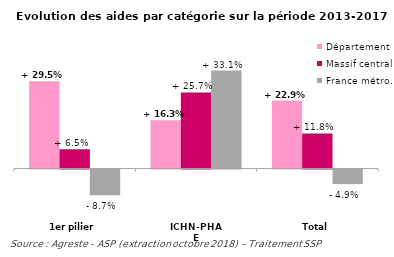
| Category | Département | Massif central | France métro. |
|---|---|---|---|
| 1er pilier | 0.295 | 0.065 | -0.087 |
| ICHN-PHAE | 0.163 | 0.257 | 0.331 |
| Total | 0.229 | 0.118 | -0.049 |